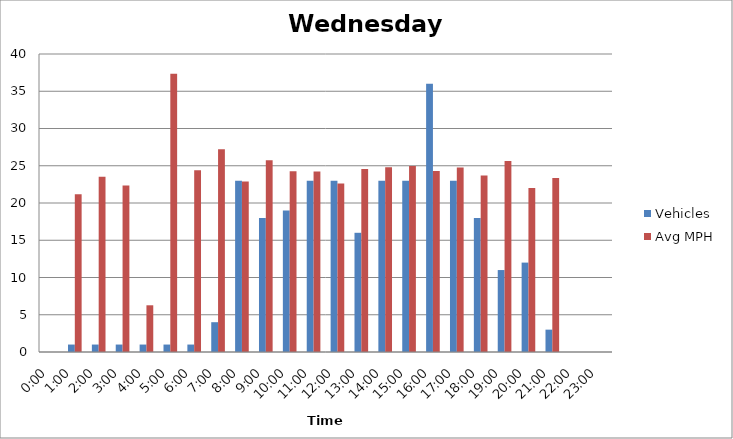
| Category | Vehicles | Avg MPH |
|---|---|---|
| 0:00 | 0 | 0 |
| 1:00 | 1 | 21.16 |
| 2:00 | 1 | 23.51 |
| 3:00 | 1 | 22.35 |
| 4:00 | 1 | 6.27 |
| 5:00 | 1 | 37.35 |
| 6:00 | 1 | 24.38 |
| 7:00 | 4 | 27.21 |
| 8:00 | 23 | 22.9 |
| 9:00 | 18 | 25.75 |
| 10:00 | 19 | 24.26 |
| 11:00 | 23 | 24.24 |
| 12:00 | 23 | 22.61 |
| 13:00 | 16 | 24.56 |
| 14:00 | 23 | 24.81 |
| 15:00 | 23 | 24.98 |
| 16:00 | 36 | 24.3 |
| 17:00 | 23 | 24.75 |
| 18:00 | 18 | 23.68 |
| 19:00 | 11 | 25.65 |
| 20:00 | 12 | 22.01 |
| 21:00 | 3 | 23.36 |
| 22:00 | 0 | 0 |
| 23:00 | 0 | 0 |